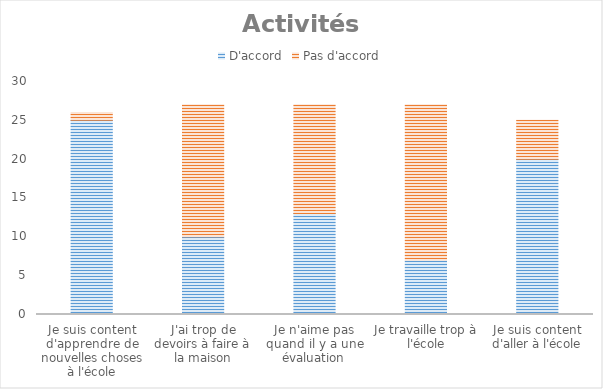
| Category | D'accord | Pas d'accord |
|---|---|---|
| Je suis content d'apprendre de nouvelles choses à l'école | 25 | 1 |
| J'ai trop de devoirs à faire à la maison | 10 | 17 |
| Je n'aime pas quand il y a une évaluation | 13 | 14 |
| Je travaille trop à l'école | 7 | 20 |
| Je suis content d'aller à l'école | 20 | 5 |